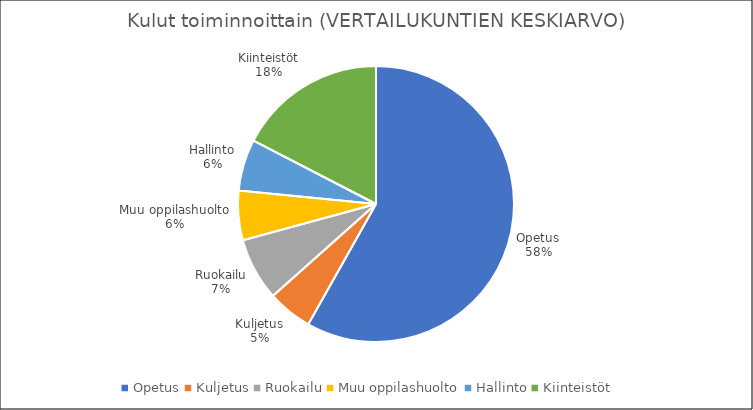
| Category | Series 0 |
|---|---|
| Opetus | 5268.782 |
| Kuljetus | 475.337 |
| Ruokailu | 666.074 |
| Muu oppilashuolto | 525.704 |
| Hallinto | 546.474 |
| Kiinteistöt | 1576.754 |